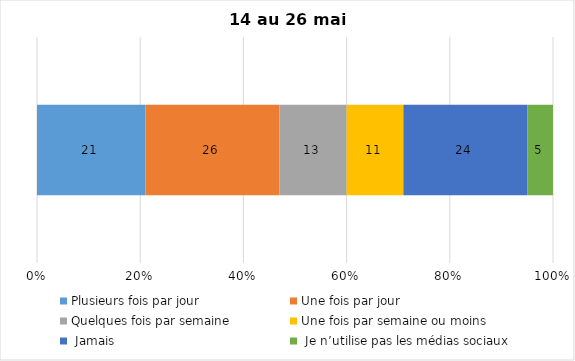
| Category | Plusieurs fois par jour | Une fois par jour | Quelques fois par semaine   | Une fois par semaine ou moins   |  Jamais   |  Je n’utilise pas les médias sociaux |
|---|---|---|---|---|---|---|
| 0 | 21 | 26 | 13 | 11 | 24 | 5 |